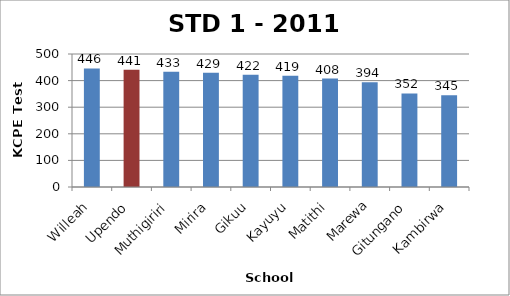
| Category | STD 1 Total Score |
|---|---|
| Willeah | 445.8 |
| Upendo | 440.5 |
| Muthigiriri | 432.86 |
| Mirira | 429.42 |
| Gikuu | 421.78 |
| Kayuyu | 418.58 |
| Matithi | 407.85 |
| Marewa | 394.1 |
| Gitungano | 351.72 |
| Kambirwa | 345.19 |